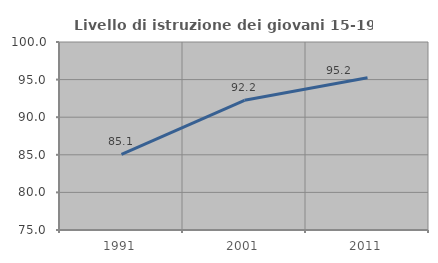
| Category | Livello di istruzione dei giovani 15-19 anni |
|---|---|
| 1991.0 | 85.057 |
| 2001.0 | 92.248 |
| 2011.0 | 95.238 |